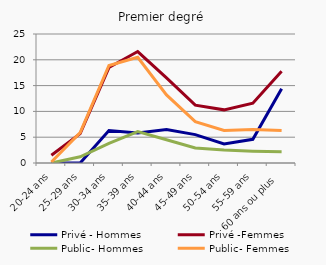
| Category | Privé - Hommes | Privé -Femmes | Public- Hommes | Public- Femmes |
|---|---|---|---|---|
| 20-24 ans | 0 | 1.5 | 0 | 0.2 |
| 25-29 ans | 0 | 5.7 | 1.2 | 5.9 |
| 30-34 ans | 6.3 | 18.5 | 3.8 | 18.9 |
| 35-39 ans | 5.8 | 21.6 | 6.1 | 20.5 |
| 40-44 ans | 6.5 | 16.5 | 4.5 | 13.2 |
| 45-49 ans | 5.5 | 11.2 | 2.9 | 8 |
| 50-54 ans | 3.7 | 10.3 | 2.5 | 6.3 |
| 55-59 ans | 4.6 | 11.6 | 2.3 | 6.5 |
| 60 ans ou plus | 14.4 | 17.8 | 2.2 | 6.3 |